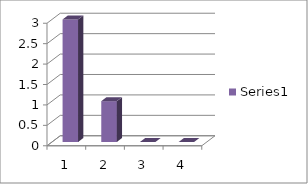
| Category | Series 0 |
|---|---|
| 0 | 3 |
| 1 | 1 |
| 2 | 0 |
| 3 | 0 |